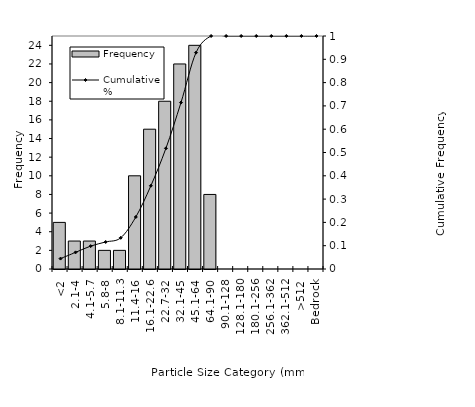
| Category | Frequency |
|---|---|
| <2 | 5 |
| 2.1-4 | 3 |
| 4.1-5.7 | 3 |
| 5.8-8 | 2 |
| 8.1-11.3 | 2 |
| 11.4-16 | 10 |
| 16.1-22.6 | 15 |
| 22.7-32 | 18 |
| 32.1-45 | 22 |
| 45.1-64 | 24 |
| 64.1-90 | 8 |
| 90.1-128 | 0 |
| 128.1-180 | 0 |
| 180.1-256 | 0 |
| 256.1-362 | 0 |
| 362.1-512 | 0 |
| >512 | 0 |
| Bedrock | 0 |